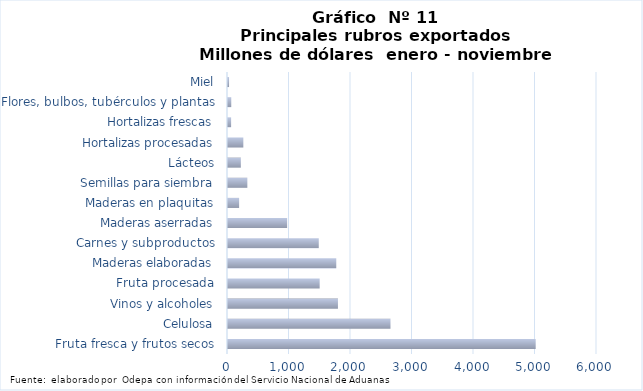
| Category | Series 7 |
|---|---|
| Fruta fresca y frutos secos | 5003088.985 |
| Celulosa | 2642076.669 |
| Vinos y alcoholes | 1787764.682 |
| Fruta procesada | 1490410.199 |
| Maderas elaboradas | 1760512.212 |
| Carnes y subproductos | 1475810.088 |
| Maderas aserradas | 961509.331 |
| Maderas en plaquitas | 180835.728 |
| Semillas para siembra | 314608.628 |
| Lácteos | 208928.817 |
| Hortalizas procesadas | 249286.504 |
| Hortalizas frescas | 50687.853 |
| Flores, bulbos, tubérculos y plantas | 53104.067 |
| Miel | 17053.39 |